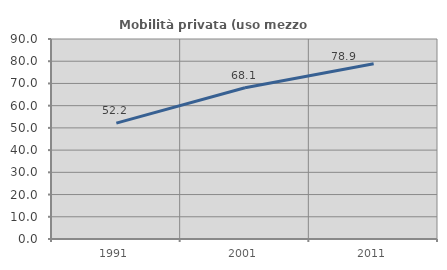
| Category | Mobilità privata (uso mezzo privato) |
|---|---|
| 1991.0 | 52.163 |
| 2001.0 | 68.091 |
| 2011.0 | 78.897 |